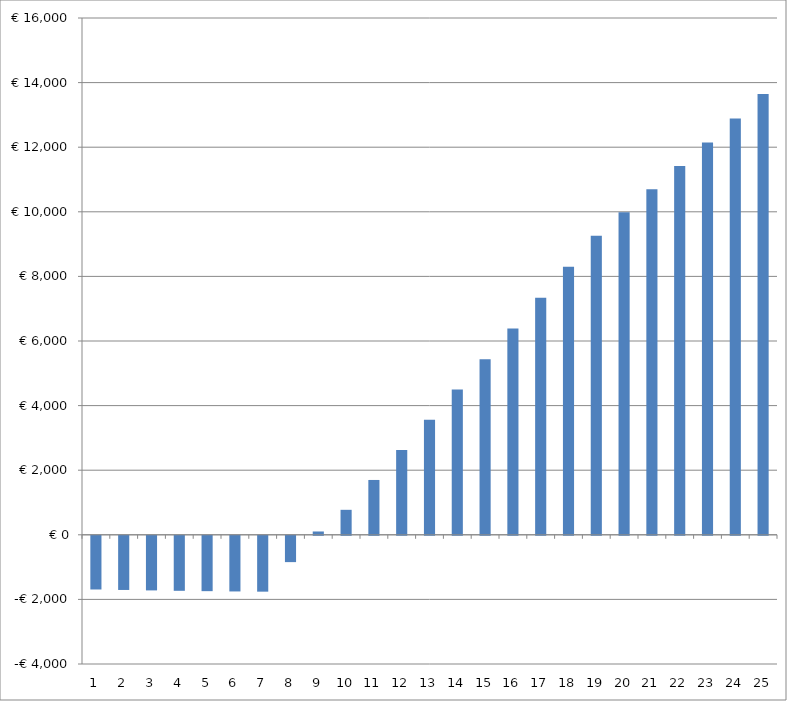
| Category | Series 0 |
|---|---|
| 0 | -1662.083 |
| 1 | -1676.9 |
| 2 | -1690.672 |
| 3 | -1703.114 |
| 4 | -1713.931 |
| 5 | -1722.824 |
| 6 | -1729.488 |
| 7 | -814.802 |
| 8 | 102.748 |
| 9 | 773.491 |
| 10 | 1697.763 |
| 11 | 2625.907 |
| 12 | 3558.279 |
| 13 | 4495.238 |
| 14 | 5437.156 |
| 15 | 6384.413 |
| 16 | 7337.398 |
| 17 | 8296.511 |
| 18 | 9262.161 |
| 19 | 9984.768 |
| 20 | 10695.605 |
| 21 | 11416.695 |
| 22 | 12148.471 |
| 23 | 12891.378 |
| 24 | 13645.871 |